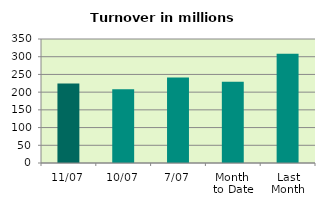
| Category | Series 0 |
|---|---|
| 11/07 | 224.48 |
| 10/07 | 207.852 |
| 7/07 | 241.535 |
| Month 
to Date | 229.606 |
| Last
Month | 308.534 |